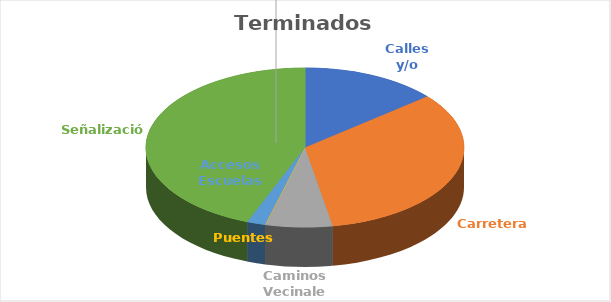
| Category | Terminados (kms) |
|---|---|
| Calles y/o Avenidas | 79.4 |
| Carreteras | 189.7 |
| Caminos Vecinales | 38.7 |
| Puentes  | 0 |
| Accesos Escuelas | 10.7 |
| Señalización | 251.3 |